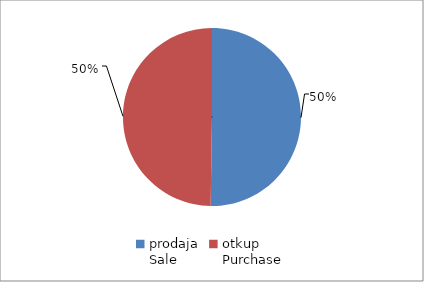
| Category | Series 0 |
|---|---|
| prodaja
Sale | 11273609.11 |
| otkup
Purchase | 11163889.06 |